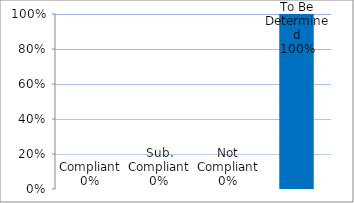
| Category | Series 0 |
|---|---|
| Compliant | 0 |
| Sub. Compliant | 0 |
| Not Compliant | 0 |
| To Be Determined | 1 |